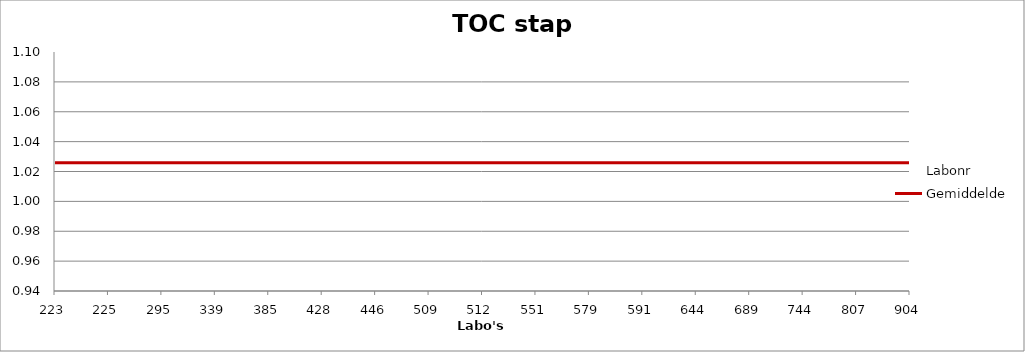
| Category | Labonr | Gemiddelde |
|---|---|---|
| 223.0 | 1.009 | 1.026 |
| 225.0 | 1.004 | 1.026 |
| 295.0 | 1.017 | 1.026 |
| 339.0 | 1.035 | 1.026 |
| 385.0 | 1.072 | 1.026 |
| 428.0 | 1.033 | 1.026 |
| 446.0 | 1.061 | 1.026 |
| 509.0 | 1.041 | 1.026 |
| 512.0 | 1.08 | 1.026 |
| 551.0 | 1.02 | 1.026 |
| 579.0 | 1.012 | 1.026 |
| 591.0 | 1.017 | 1.026 |
| 644.0 | 0.952 | 1.026 |
| 689.0 | 0.958 | 1.026 |
| 744.0 | 1.003 | 1.026 |
| 807.0 | 1.041 | 1.026 |
| 904.0 | 1.047 | 1.026 |